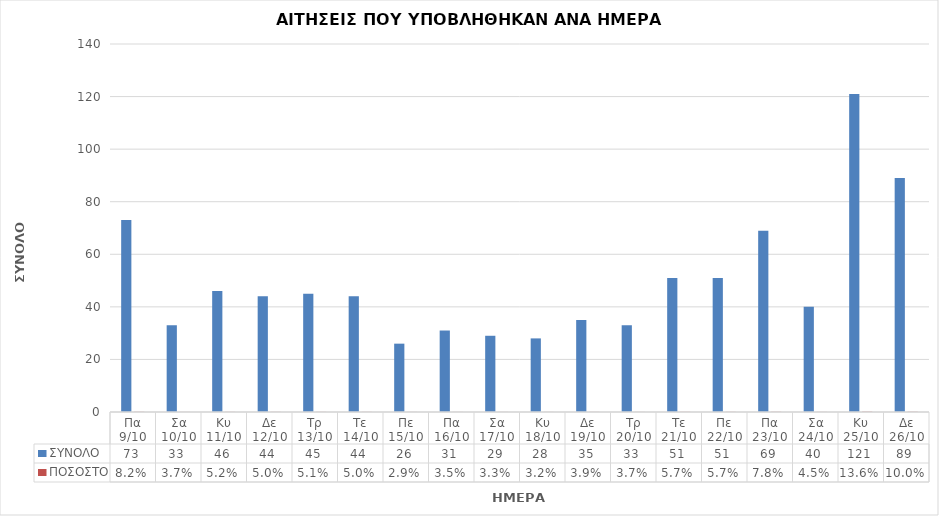
| Category | ΣΥΝΟΛΟ | ΠΟΣΟΣΤΟ |
|---|---|---|
| Πα 9/10 | 73 | 0.082 |
| Σα 10/10 | 33 | 0.037 |
| Κυ 11/10 | 46 | 0.052 |
| Δε 12/10 | 44 | 0.05 |
| Τρ 13/10 | 45 | 0.051 |
| Τε 14/10 | 44 | 0.05 |
| Πε 15/10 | 26 | 0.029 |
| Πα 16/10 | 31 | 0.035 |
| Σα 17/10 | 29 | 0.033 |
| Κυ 18/10 | 28 | 0.032 |
| Δε 19/10 | 35 | 0.039 |
| Τρ 20/10 | 33 | 0.037 |
| Τε 21/10 | 51 | 0.057 |
| Πε 22/10 | 51 | 0.057 |
| Πα 23/10 | 69 | 0.078 |
| Σα 24/10 | 40 | 0.045 |
| Κυ 25/10 | 121 | 0.136 |
| Δε 26/10 | 89 | 0.1 |